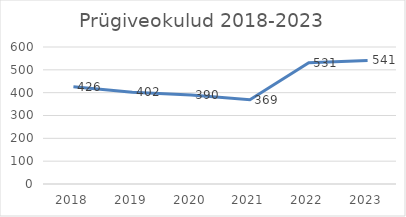
| Category | Series 0 |
|---|---|
| 2018.0 | 426 |
| 2019.0 | 402 |
| 2020.0 | 390 |
| 2021.0 | 369 |
| 2022.0 | 531 |
| 2023.0 | 541 |